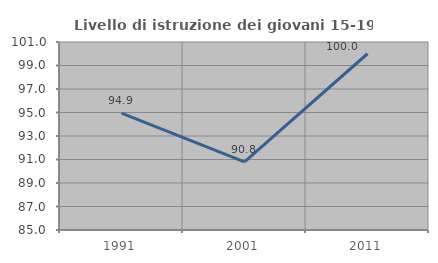
| Category | Livello di istruzione dei giovani 15-19 anni |
|---|---|
| 1991.0 | 94.949 |
| 2001.0 | 90.789 |
| 2011.0 | 100 |